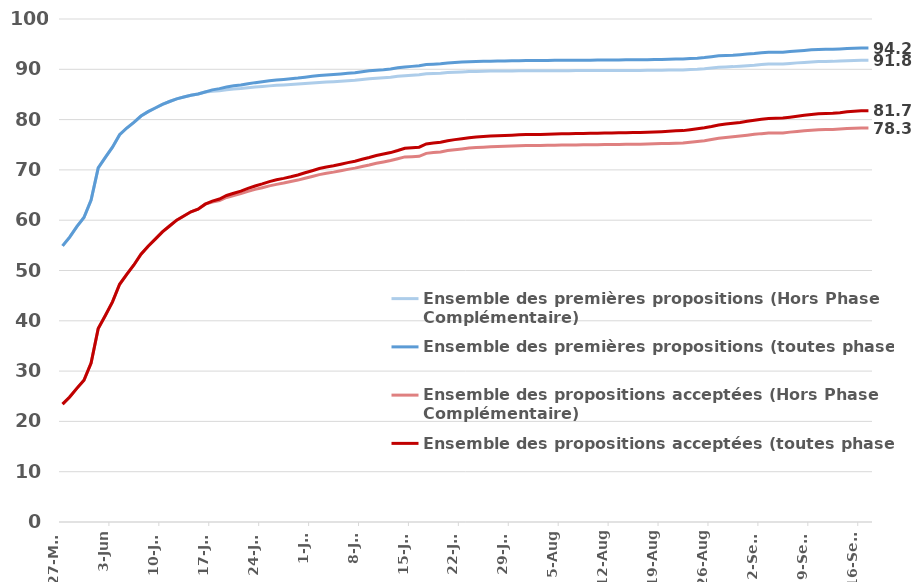
| Category | Ensemble des premières propositions (Hors Phase Complémentaire) | Ensemble des premières propositions (toutes phases) | Ensemble des propositions acceptées (Hors Phase Complémentaire) | Ensemble des propositions acceptées (toutes phases) |
|---|---|---|---|---|
| 2021-05-27 | 54.891 | 54.891 | 23.429 | 23.429 |
| 2021-05-28 | 56.644 | 56.644 | 24.838 | 24.838 |
| 2021-05-29 | 58.714 | 58.714 | 26.565 | 26.565 |
| 2021-05-30 | 60.54 | 60.54 | 28.187 | 28.187 |
| 2021-05-31 | 64.013 | 64.013 | 31.606 | 31.606 |
| 2021-06-01 | 70.412 | 70.412 | 38.485 | 38.485 |
| 2021-06-02 | 72.479 | 72.479 | 41.049 | 41.049 |
| 2021-06-03 | 74.527 | 74.527 | 43.752 | 43.752 |
| 2021-06-04 | 76.983 | 76.983 | 47.261 | 47.261 |
| 2021-06-05 | 78.327 | 78.327 | 49.239 | 49.239 |
| 2021-06-06 | 79.449 | 79.449 | 51.096 | 51.096 |
| 2021-06-07 | 80.7 | 80.7 | 53.239 | 53.239 |
| 2021-06-08 | 81.582 | 81.582 | 54.837 | 54.837 |
| 2021-06-09 | 82.315 | 82.315 | 56.225 | 56.225 |
| 2021-06-10 | 83.036 | 83.036 | 57.671 | 57.671 |
| 2021-06-11 | 83.602 | 83.602 | 58.847 | 58.847 |
| 2021-06-12 | 84.127 | 84.127 | 60.011 | 60.011 |
| 2021-06-13 | 84.489 | 84.489 | 60.83 | 60.83 |
| 2021-06-14 | 84.85 | 84.85 | 61.668 | 61.668 |
| 2021-06-15 | 85.084 | 85.084 | 62.19 | 62.19 |
| 2021-06-16 | 85.494 | 85.494 | 63.183 | 63.183 |
| 2021-06-17 | 85.637 | 85.913 | 63.612 | 63.794 |
| 2021-06-18 | 85.731 | 86.161 | 63.914 | 64.202 |
| 2021-06-19 | 85.932 | 86.492 | 64.515 | 64.908 |
| 2021-06-20 | 86.089 | 86.709 | 64.916 | 65.359 |
| 2021-06-21 | 86.195 | 86.881 | 65.281 | 65.779 |
| 2021-06-22 | 86.343 | 87.134 | 65.73 | 66.33 |
| 2021-06-23 | 86.47 | 87.348 | 66.121 | 66.806 |
| 2021-06-24 | 86.587 | 87.529 | 66.467 | 67.221 |
| 2021-06-25 | 86.705 | 87.719 | 66.83 | 67.675 |
| 2021-06-26 | 86.807 | 87.884 | 67.127 | 68.031 |
| 2021-06-27 | 86.891 | 87.994 | 67.385 | 68.317 |
| 2021-06-28 | 86.978 | 88.112 | 67.678 | 68.641 |
| 2021-06-29 | 87.067 | 88.258 | 67.975 | 68.998 |
| 2021-06-30 | 87.179 | 88.436 | 68.337 | 69.424 |
| 2021-07-01 | 87.281 | 88.597 | 68.686 | 69.838 |
| 2021-07-02 | 87.388 | 88.756 | 69.062 | 70.271 |
| 2021-07-03 | 87.478 | 88.888 | 69.33 | 70.583 |
| 2021-07-04 | 87.54 | 88.967 | 69.561 | 70.83 |
| 2021-07-05 | 87.625 | 89.075 | 69.837 | 71.131 |
| 2021-07-06 | 87.705 | 89.193 | 70.1 | 71.443 |
| 2021-07-07 | 87.801 | 89.321 | 70.347 | 71.732 |
| 2021-07-08 | 87.978 | 89.529 | 70.69 | 72.118 |
| 2021-07-09 | 88.113 | 89.695 | 70.981 | 72.46 |
| 2021-07-10 | 88.215 | 89.833 | 71.31 | 72.848 |
| 2021-07-11 | 88.299 | 89.93 | 71.586 | 73.149 |
| 2021-07-12 | 88.413 | 90.062 | 71.853 | 73.446 |
| 2021-07-13 | 88.615 | 90.305 | 72.201 | 73.859 |
| 2021-07-14 | 88.735 | 90.474 | 72.581 | 74.308 |
| 2021-07-15 | 88.815 | 90.582 | 72.637 | 74.403 |
| 2021-07-16 | 88.909 | 90.716 | 72.697 | 74.522 |
| 2021-07-17 | 89.112 | 90.954 | 73.29 | 75.165 |
| 2021-07-18 | 89.167 | 91.026 | 73.445 | 75.348 |
| 2021-07-19 | 89.231 | 91.114 | 73.569 | 75.508 |
| 2021-07-20 | 89.351 | 91.25 | 73.841 | 75.806 |
| 2021-07-21 | 89.427 | 91.35 | 74.017 | 76.018 |
| 2021-07-22 | 89.487 | 91.428 | 74.16 | 76.189 |
| 2021-07-23 | 89.55 | 91.505 | 74.331 | 76.386 |
| 2021-07-24 | 89.585 | 91.554 | 74.448 | 76.527 |
| 2021-07-25 | 89.605 | 91.583 | 74.523 | 76.618 |
| 2021-07-26 | 89.641 | 91.625 | 74.624 | 76.728 |
| 2021-07-27 | 89.654 | 91.65 | 74.671 | 76.795 |
| 2021-07-28 | 89.669 | 91.672 | 74.708 | 76.847 |
| 2021-07-29 | 89.683 | 91.697 | 74.754 | 76.91 |
| 2021-07-30 | 89.696 | 91.717 | 74.802 | 76.972 |
| 2021-07-31 | 89.704 | 91.736 | 74.828 | 77.014 |
| 2021-08-01 | 89.706 | 91.743 | 74.842 | 77.035 |
| 2021-08-02 | 89.71 | 91.753 | 74.86 | 77.062 |
| 2021-08-03 | 89.718 | 91.768 | 74.892 | 77.105 |
| 2021-08-04 | 89.725 | 91.781 | 74.914 | 77.139 |
| 2021-08-05 | 89.729 | 91.789 | 74.932 | 77.165 |
| 2021-08-06 | 89.734 | 91.798 | 74.95 | 77.192 |
| 2021-08-07 | 89.741 | 91.81 | 74.973 | 77.222 |
| 2021-08-08 | 89.744 | 91.816 | 74.987 | 77.242 |
| 2021-08-09 | 89.749 | 91.824 | 75.002 | 77.263 |
| 2021-08-10 | 89.752 | 91.834 | 75.013 | 77.282 |
| 2021-08-11 | 89.759 | 91.846 | 75.035 | 77.314 |
| 2021-08-12 | 89.765 | 91.858 | 75.052 | 77.343 |
| 2021-08-13 | 89.771 | 91.866 | 75.069 | 77.368 |
| 2021-08-14 | 89.774 | 91.874 | 75.081 | 77.387 |
| 2021-08-15 | 89.779 | 91.883 | 75.1 | 77.412 |
| 2021-08-16 | 89.784 | 91.892 | 75.119 | 77.438 |
| 2021-08-17 | 89.798 | 91.915 | 75.154 | 77.491 |
| 2021-08-18 | 89.812 | 91.939 | 75.185 | 77.54 |
| 2021-08-19 | 89.832 | 91.969 | 75.228 | 77.608 |
| 2021-08-20 | 89.858 | 92.01 | 75.272 | 77.681 |
| 2021-08-21 | 89.868 | 92.049 | 75.3 | 77.774 |
| 2021-08-22 | 89.876 | 92.062 | 75.326 | 77.809 |
| 2021-08-23 | 89.946 | 92.137 | 75.497 | 77.989 |
| 2021-08-24 | 90.011 | 92.22 | 75.644 | 78.172 |
| 2021-08-25 | 90.115 | 92.338 | 75.811 | 78.375 |
| 2021-08-26 | 90.253 | 92.495 | 76.036 | 78.636 |
| 2021-08-27 | 90.419 | 92.677 | 76.29 | 78.93 |
| 2021-08-28 | 90.479 | 92.754 | 76.459 | 79.136 |
| 2021-08-29 | 90.532 | 92.812 | 76.583 | 79.276 |
| 2021-08-30 | 90.63 | 92.916 | 76.736 | 79.445 |
| 2021-08-31 | 90.721 | 93.025 | 76.909 | 79.668 |
| 2021-09-01 | 90.804 | 93.124 | 77.067 | 79.867 |
| 2021-09-02 | 90.939 | 93.271 | 77.21 | 80.054 |
| 2021-09-03 | 91.039 | 93.389 | 77.317 | 80.215 |
| 2021-09-04 | 91.046 | 93.405 | 77.329 | 80.27 |
| 2021-09-05 | 91.052 | 93.414 | 77.346 | 80.302 |
| 2021-09-06 | 91.161 | 93.527 | 77.512 | 80.488 |
| 2021-09-07 | 91.277 | 93.653 | 77.651 | 80.674 |
| 2021-09-08 | 91.369 | 93.755 | 77.769 | 80.842 |
| 2021-09-09 | 91.475 | 93.87 | 77.898 | 81.026 |
| 2021-09-10 | 91.557 | 93.959 | 78 | 81.183 |
| 2021-09-11 | 91.564 | 93.972 | 78.008 | 81.235 |
| 2021-09-12 | 91.576 | 93.985 | 78.018 | 81.264 |
| 2021-09-13 | 91.644 | 94.055 | 78.12 | 81.385 |
| 2021-09-14 | 91.717 | 94.135 | 78.214 | 81.539 |
| 2021-09-15 | 91.758 | 94.182 | 78.288 | 81.674 |
| 2021-09-16 | 91.792 | 94.22 | 78.31 | 81.742 |
| 2021-09-17 | 91.794 | 94.221 | 78.31 | 81.742 |